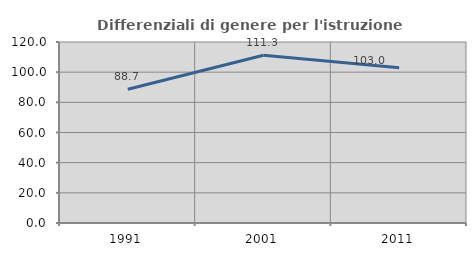
| Category | Differenziali di genere per l'istruzione superiore |
|---|---|
| 1991.0 | 88.714 |
| 2001.0 | 111.259 |
| 2011.0 | 102.968 |